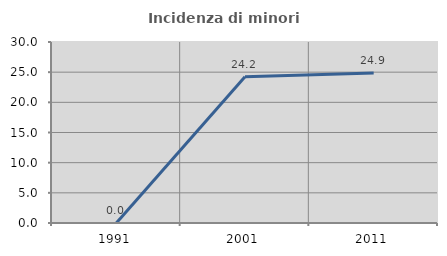
| Category | Incidenza di minori stranieri |
|---|---|
| 1991.0 | 0 |
| 2001.0 | 24.242 |
| 2011.0 | 24.855 |